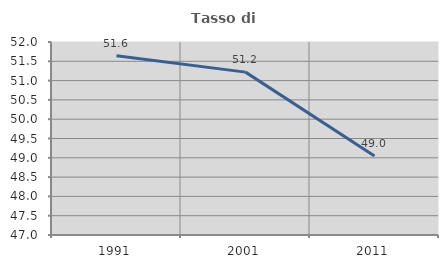
| Category | Tasso di occupazione   |
|---|---|
| 1991.0 | 51.645 |
| 2001.0 | 51.22 |
| 2011.0 | 49.049 |